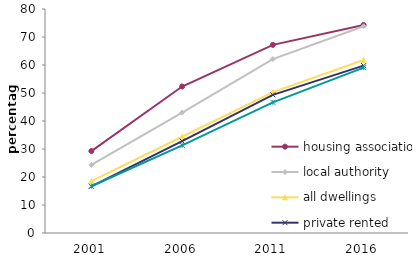
| Category | housing association | local authority | all dwellings | private rented | owner occupied |
|---|---|---|---|---|---|
| 2001.0 | 29.257 | 24.325 | 18.546 | 16.681 | 16.69 |
| 2006.0 | 52.314 | 43.021 | 34.37 | 32.825 | 31.312 |
| 2011.0 | 67.181 | 62.108 | 50.299 | 49.339 | 46.665 |
| 2016.0 | 74.295 | 73.822 | 61.791 | 59.781 | 59.073 |